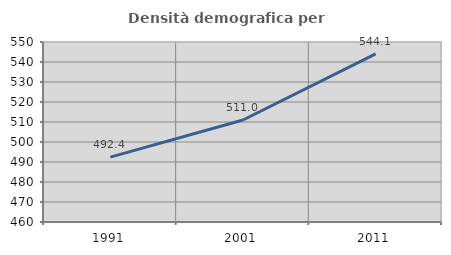
| Category | Densità demografica |
|---|---|
| 1991.0 | 492.41 |
| 2001.0 | 511.004 |
| 2011.0 | 544.075 |